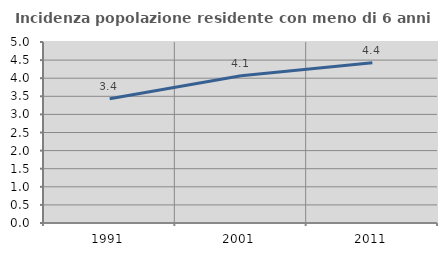
| Category | Incidenza popolazione residente con meno di 6 anni |
|---|---|
| 1991.0 | 3.434 |
| 2001.0 | 4.065 |
| 2011.0 | 4.428 |